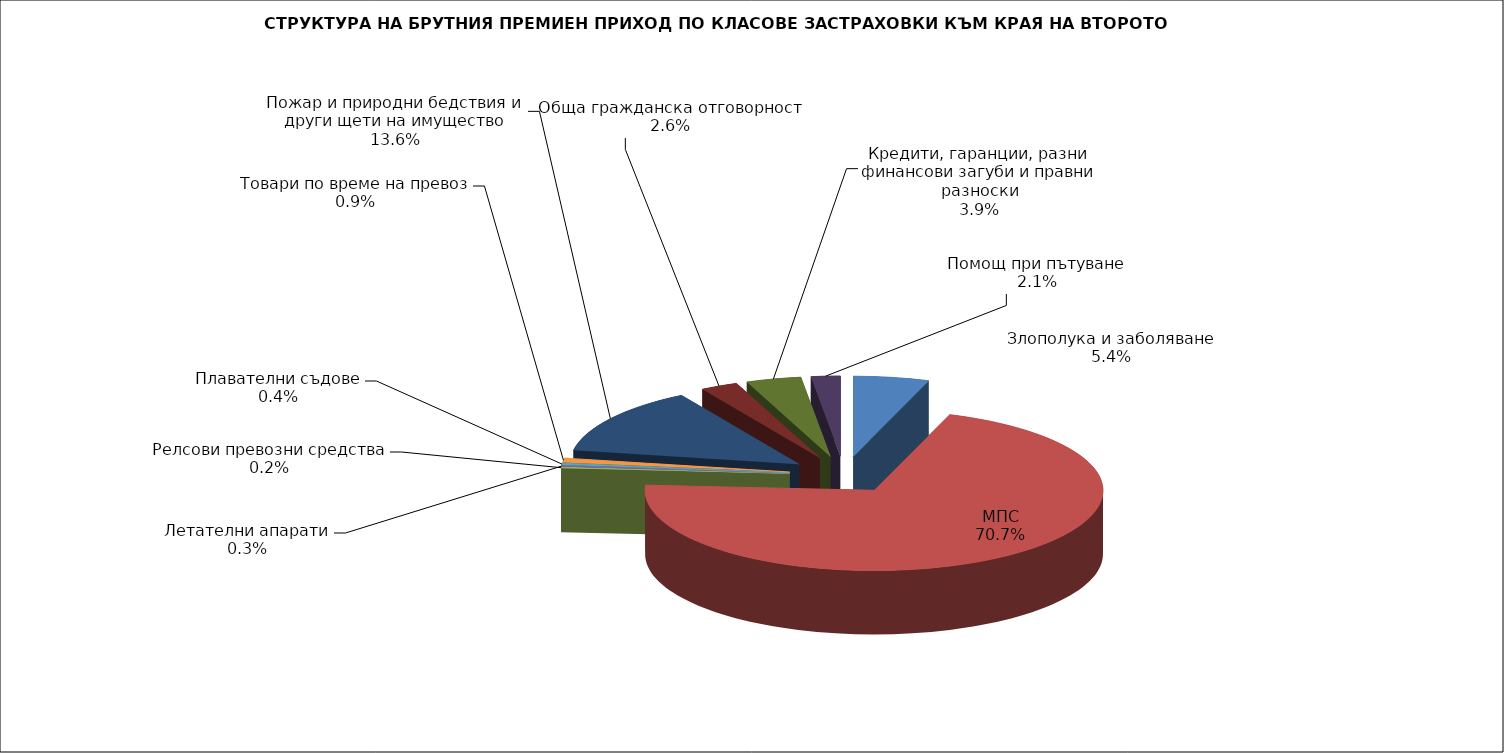
| Category | Злополука и заболяване |
|---|---|
| Злополука и заболяване | 0.054 |
| МПС | 0.707 |
| Релсови превозни средства | 0.002 |
| Летателни апарати | 0.003 |
| Плавателни съдове | 0.004 |
| Товари по време на превоз | 0.009 |
| Пожар и природни бедствия и други щети на имущество | 0.136 |
| Обща гражданска отговорност | 0.026 |
| Кредити, гаранции, разни финансови загуби и правни разноски | 0.039 |
| Помощ при пътуване | 0.021 |